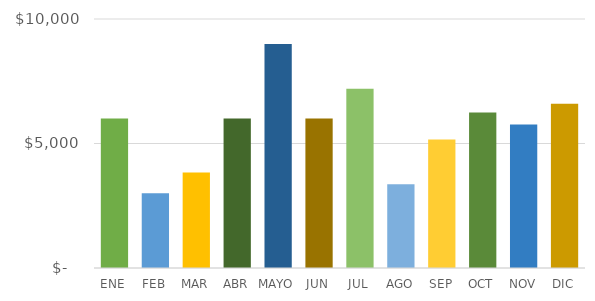
| Category | Series 0 |
|---|---|
| ENE | 6000 |
| FEB | 3000 |
| MAR | 3840 |
| ABR | 6000 |
| MAYO | 9000 |
| JUN | 6000 |
| JUL | 7200 |
| AGO | 3360 |
| SEP | 5160 |
| OCT | 6240 |
| NOV | 5760 |
| DIC | 6600 |